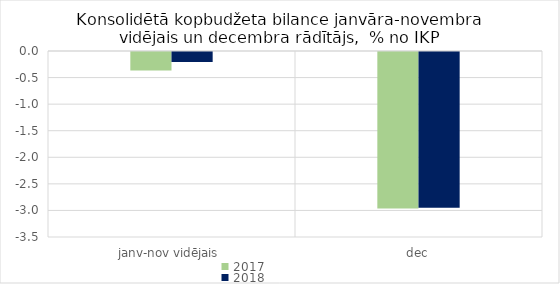
| Category | 2017 | 2018 |
|---|---|---|
| janv-nov vidējais | -0.347 | -0.188 |
| dec | -2.946 | -2.932 |